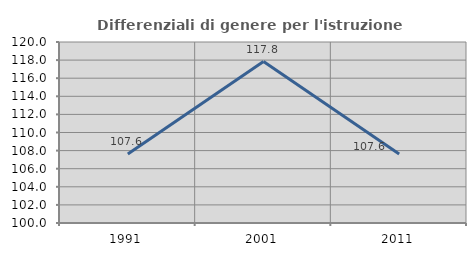
| Category | Differenziali di genere per l'istruzione superiore |
|---|---|
| 1991.0 | 107.621 |
| 2001.0 | 117.845 |
| 2011.0 | 107.635 |